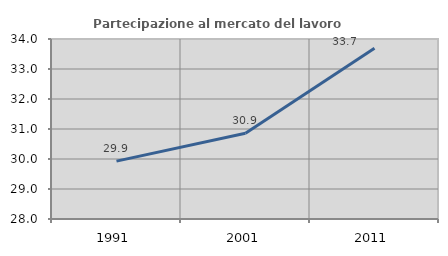
| Category | Partecipazione al mercato del lavoro  femminile |
|---|---|
| 1991.0 | 29.928 |
| 2001.0 | 30.856 |
| 2011.0 | 33.691 |